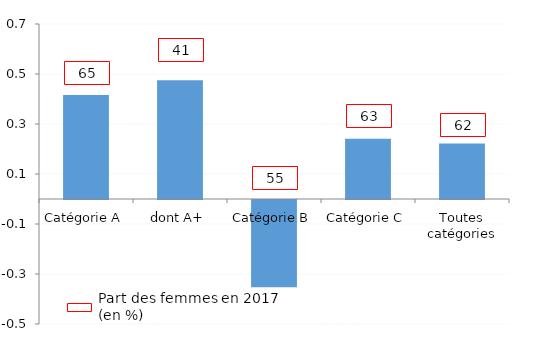
| Category | Series 0 |
|---|---|
| Catégorie A | 0.416 |
| dont A+ | 0.475 |
| Catégorie B | -0.349 |
| Catégorie C | 0.241 |
| Toutes catégories | 0.222 |